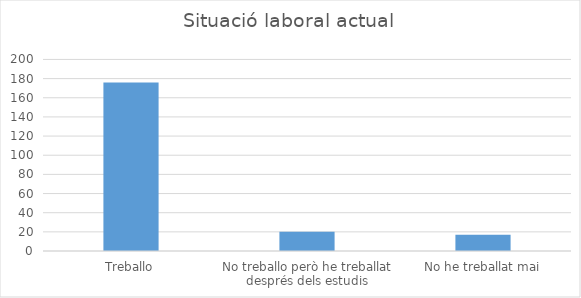
| Category | Series 0 |
|---|---|
| Treballo | 176 |
| No treballo però he treballat després dels estudis | 20 |
| No he treballat mai | 17 |